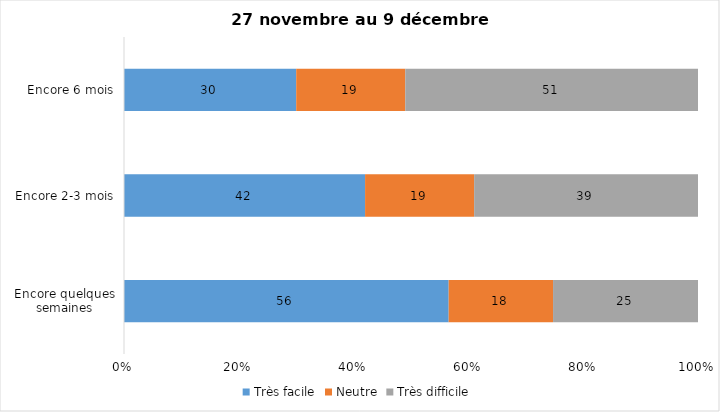
| Category | Très facile | Neutre | Très difficile |
|---|---|---|---|
| Encore quelques semaines | 56 | 18 | 25 |
| Encore 2-3 mois | 42 | 19 | 39 |
| Encore 6 mois | 30 | 19 | 51 |